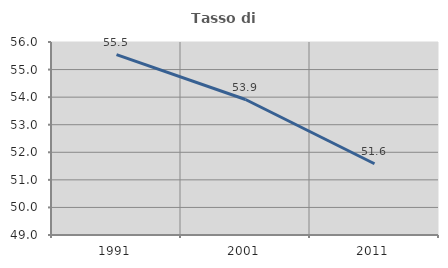
| Category | Tasso di occupazione   |
|---|---|
| 1991.0 | 55.544 |
| 2001.0 | 53.914 |
| 2011.0 | 51.584 |